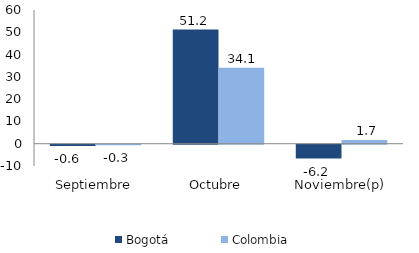
| Category | Bogotá | Colombia |
|---|---|---|
| Septiembre | -0.593 | -0.281 |
| Octubre | 51.243 | 34.09 |
| Noviembre(p) | -6.208 | 1.677 |